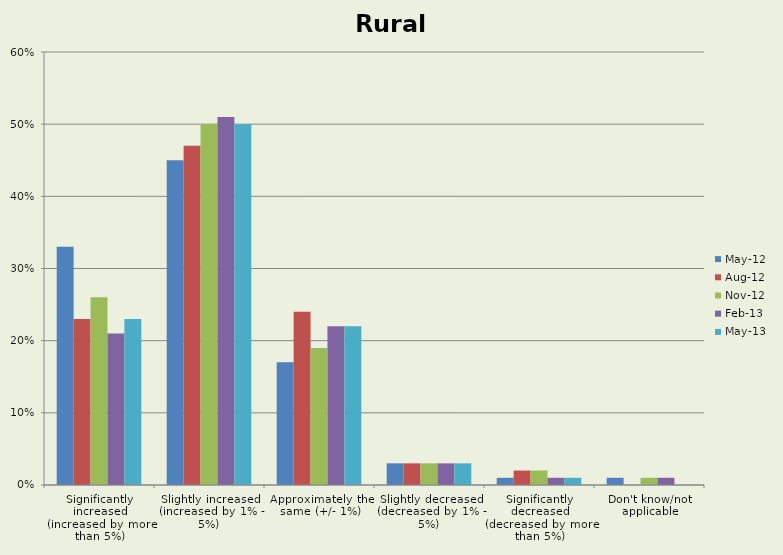
| Category | May-12 | Aug-12 | Nov-12 | Feb-13 | May-13 |
|---|---|---|---|---|---|
| Significantly increased (increased by more than 5%) | 0.33 | 0.23 | 0.26 | 0.21 | 0.23 |
| Slightly increased (increased by 1% - 5%) | 0.45 | 0.47 | 0.5 | 0.51 | 0.5 |
| Approximately the same (+/- 1%) | 0.17 | 0.24 | 0.19 | 0.22 | 0.22 |
| Slightly decreased (decreased by 1% - 5%) | 0.03 | 0.03 | 0.03 | 0.03 | 0.03 |
| Significantly decreased (decreased by more than 5%) | 0.01 | 0.02 | 0.02 | 0.01 | 0.01 |
| Don't know/not applicable | 0.01 | 0 | 0.01 | 0.01 | 0 |